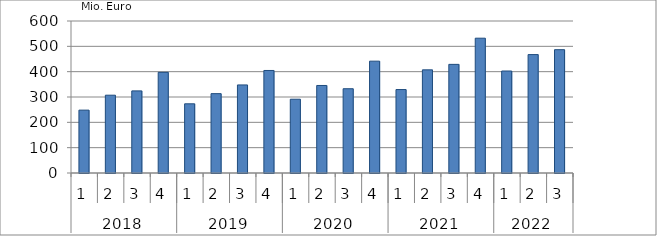
| Category | Ausbaugewerblicher Umsatz3 |
|---|---|
| 0 | 248133.418 |
| 1 | 307099.899 |
| 2 | 324088.989 |
| 3 | 397377.201 |
| 4 | 273159.137 |
| 5 | 313254.251 |
| 6 | 347631.281 |
| 7 | 404721.054 |
| 8 | 291272.144 |
| 9 | 345494.215 |
| 10 | 332629.265 |
| 11 | 441463.36 |
| 12 | 329380.212 |
| 13 | 407164.972 |
| 14 | 428783.222 |
| 15 | 532137.089 |
| 16 | 402625.565 |
| 17 | 467398.849 |
| 18 | 486819.26 |